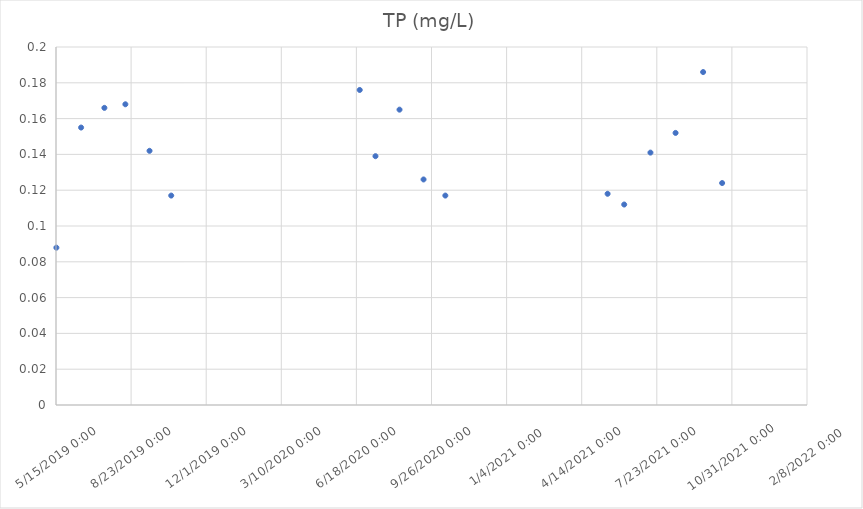
| Category | TP (mg/L) |
|---|---|
| 43600.50347222222 | 0.088 |
| 43633.419444444444 | 0.155 |
| 43664.42916666667 | 0.166 |
| 43692.37152777778 | 0.168 |
| 43724.53888888889 | 0.142 |
| 43753.425 | 0.117 |
| 44004.41458333333 | 0.176 |
| 44025.410416666666 | 0.139 |
| 44057.40902777778 | 0.165 |
| 44089.416666666664 | 0.126 |
| 44118.424305555556 | 0.117 |
| 44334.49097222222 | 0.118 |
| 44356.59722222222 | 0.112 |
| 44391.541666666664 | 0.141 |
| 44425.0 | 0.152 |
| 44461.680555555555 | 0.186 |
| 44487.0 | 0.124 |